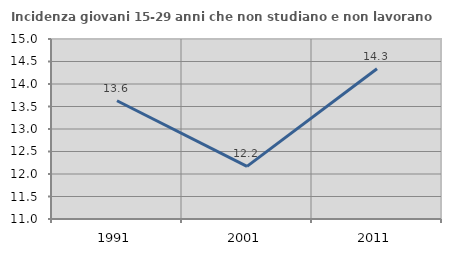
| Category | Incidenza giovani 15-29 anni che non studiano e non lavorano  |
|---|---|
| 1991.0 | 13.627 |
| 2001.0 | 12.17 |
| 2011.0 | 14.339 |